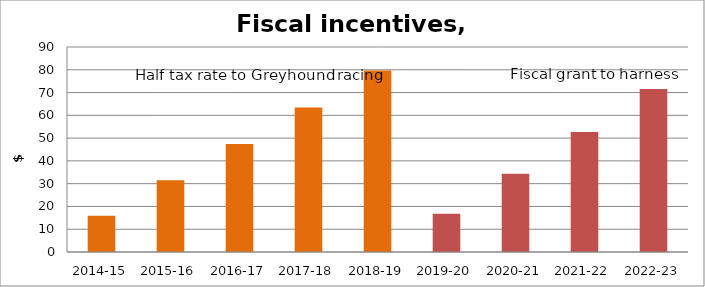
| Category | Series 0 |
|---|---|
| 2014-15 | 15.889 |
| 2015-16 | 31.513 |
| 2016-17 | 47.37 |
| 2017-18 | 63.415 |
| 2018-19 | 79.727 |
| 2019-20 | 16.832 |
| 2020-21 | 34.374 |
| 2021-22 | 52.631 |
| 2022-23 | 71.609 |